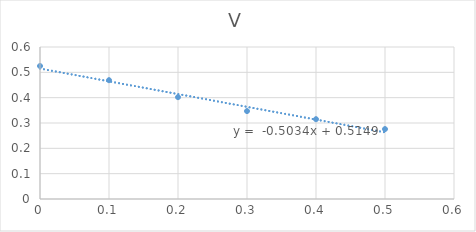
| Category | V |
|---|---|
| 0.5 | 0.276 |
| 0.4 | 0.315 |
| 0.3 | 0.347 |
| 0.2 | 0.402 |
| 0.1 | 0.469 |
| 0.0 | 0.525 |